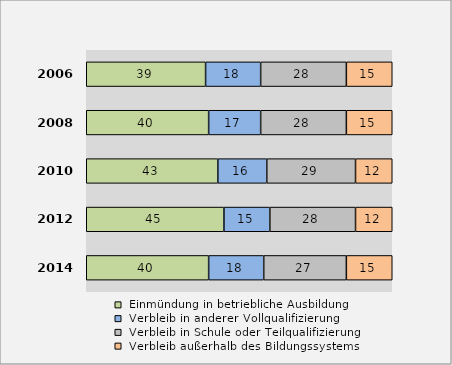
| Category |  Einmündung in betriebliche Ausbildung |  Verbleib in anderer Vollqualifizierung |  Verbleib in Schule oder Teilqualifizierung |  Verbleib außerhalb des Bildungssystems |
|---|---|---|---|---|
| 2014.0 | 40 | 18 | 27 | 15 |
| 2012.0 | 45 | 15 | 28 | 12 |
| 2010.0 | 43 | 16 | 29 | 12 |
| 2008.0 | 40 | 17 | 28 | 15 |
| 2006.0 | 39 | 18 | 28 | 15 |